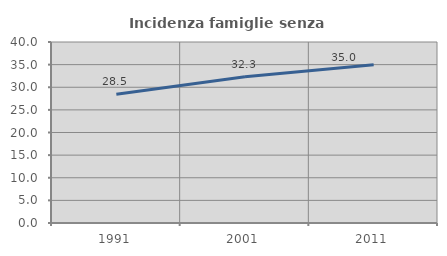
| Category | Incidenza famiglie senza nuclei |
|---|---|
| 1991.0 | 28.465 |
| 2001.0 | 32.3 |
| 2011.0 | 34.996 |